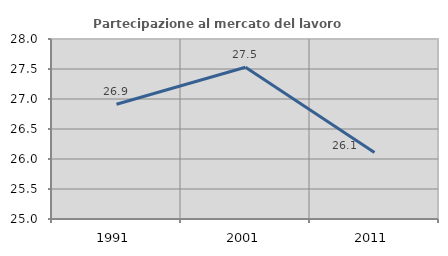
| Category | Partecipazione al mercato del lavoro  femminile |
|---|---|
| 1991.0 | 26.913 |
| 2001.0 | 27.53 |
| 2011.0 | 26.108 |